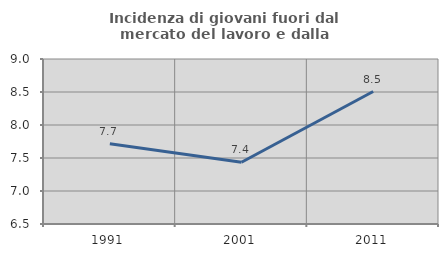
| Category | Incidenza di giovani fuori dal mercato del lavoro e dalla formazione  |
|---|---|
| 1991.0 | 7.717 |
| 2001.0 | 7.435 |
| 2011.0 | 8.507 |